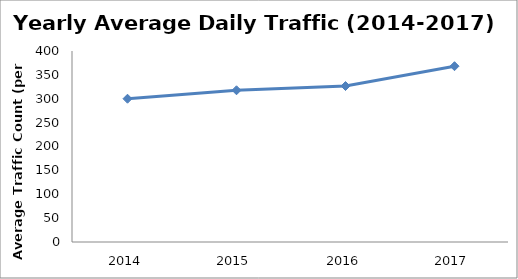
| Category | Series 0 |
|---|---|
| 2014.0 | 300.014 |
| 2015.0 | 317.792 |
| 2016.0 | 326.656 |
| 2017.0 | 368.173 |